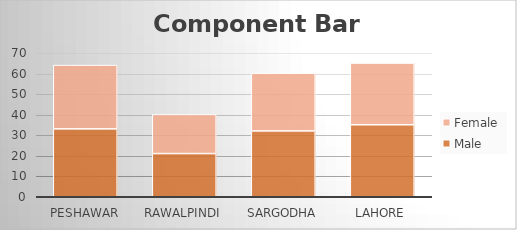
| Category | Male | Female |
|---|---|---|
| Peshawar | 33 | 31 |
| Rawalpindi | 21 | 19 |
| Sargodha | 32 | 28 |
| Lahore | 35 | 30 |